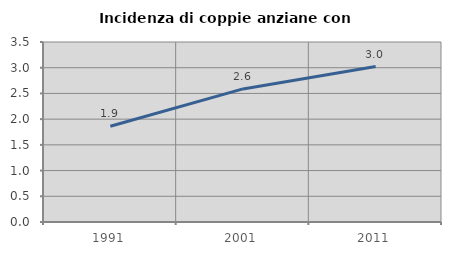
| Category | Incidenza di coppie anziane con figli |
|---|---|
| 1991.0 | 1.861 |
| 2001.0 | 2.588 |
| 2011.0 | 3.022 |